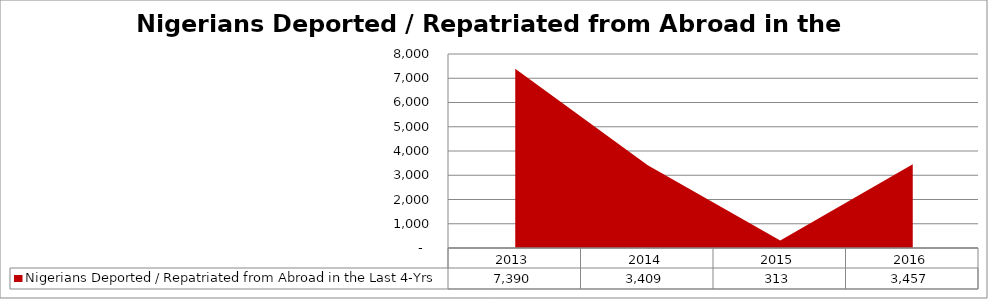
| Category | Nigerians Deported / Repatriated from Abroad in the Last 4-Yrs |
|---|---|
| 2013.0 | 7390 |
| 2014.0 | 3409 |
| 2015.0 | 313 |
| 2016.0 | 3457 |